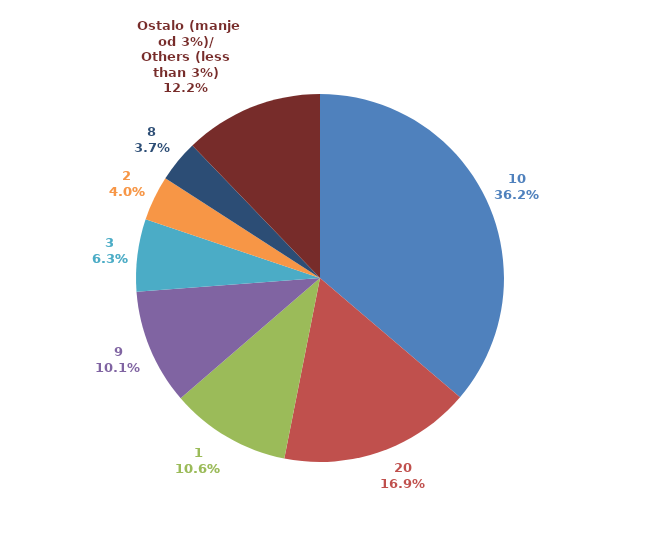
| Category | Series 0 |
|---|---|
| 10 | 29996467.45 |
| 20 | 13970372.72 |
| 1 | 8749772.84 |
| 9 | 8395298.4 |
| 3 | 5252698.16 |
| 2 | 3272742.66 |
| 8 | 3046899.88 |
|  Ostalo (manje od 3%)/
Others (less than 3%) | 10102900.22 |